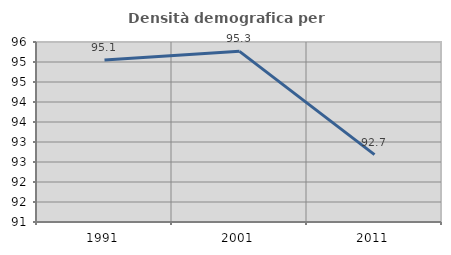
| Category | Densità demografica |
|---|---|
| 1991.0 | 95.052 |
| 2001.0 | 95.267 |
| 2011.0 | 92.684 |